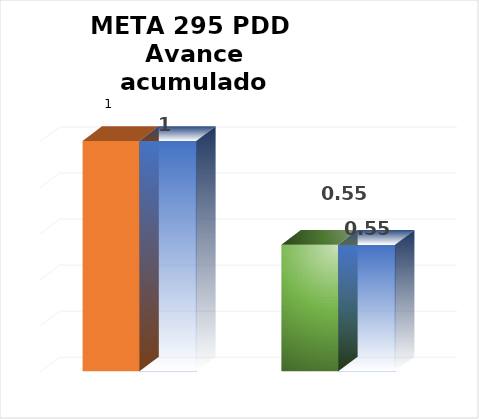
| Category | Meta PDD 2024 |
|---|---|
| 0 | 1 |
| 1 | 0.55 |